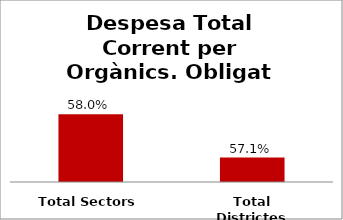
| Category | Series 0 |
|---|---|
| Total Sectors | 0.58 |
| Total Districtes | 0.571 |